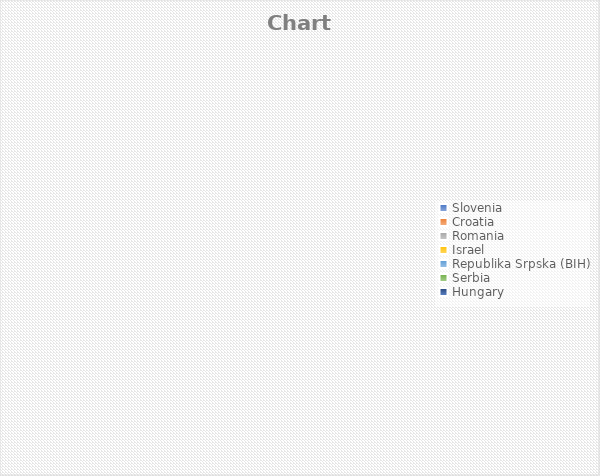
| Category | Series 0 |
|---|---|
| Slovenia | 0 |
| Croatia | 0 |
| Romania | 0 |
| Israel | 0 |
| Republika Srpska (BIH) | 0 |
| Serbia | 0 |
| Hungary | 0 |